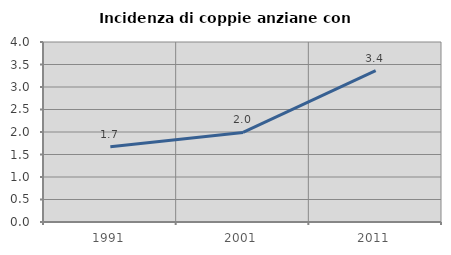
| Category | Incidenza di coppie anziane con figli |
|---|---|
| 1991.0 | 1.672 |
| 2001.0 | 1.99 |
| 2011.0 | 3.363 |